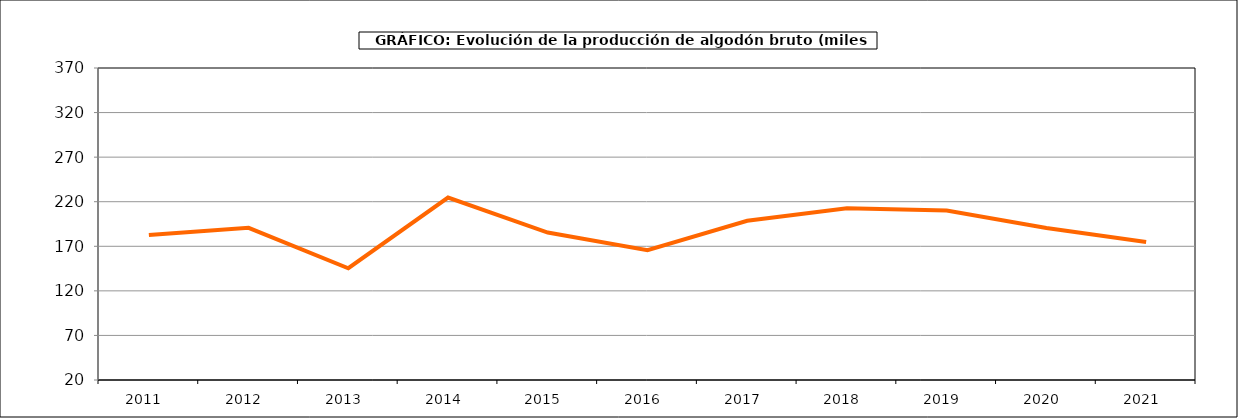
| Category | Producción |
|---|---|
| 2011.0 | 182.781 |
| 2012.0 | 190.7 |
| 2013.0 | 145.356 |
| 2014.0 | 224.734 |
| 2015.0 | 185.446 |
| 2016.0 | 165.596 |
| 2017.0 | 198.547 |
| 2018.0 | 212.587 |
| 2019.0 | 210.015 |
| 2020.0 | 190.538 |
| 2021.0 | 174.921 |